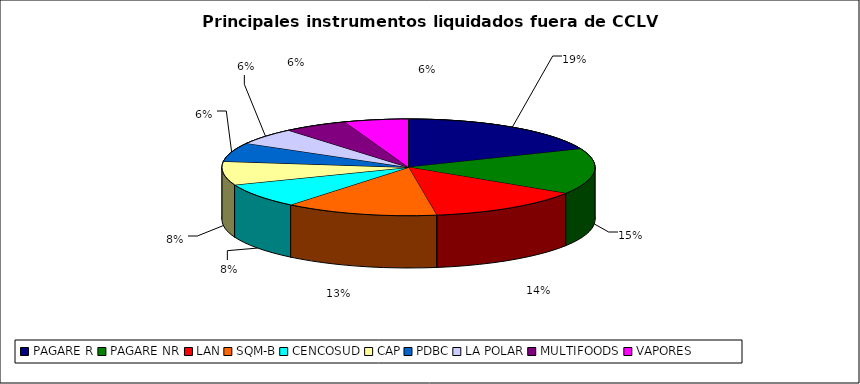
| Category | Series 0 |
|---|---|
| PAGARE R | 1696 |
| PAGARE NR | 1378 |
| LAN | 1221 |
| SQM-B | 1201 |
| CENCOSUD | 742 |
| CAP | 710 |
| PDBC | 571 |
| LA POLAR | 504 |
| MULTIFOODS | 503 |
| VAPORES | 500 |